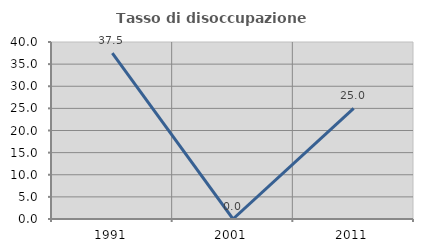
| Category | Tasso di disoccupazione giovanile  |
|---|---|
| 1991.0 | 37.5 |
| 2001.0 | 0 |
| 2011.0 | 25 |